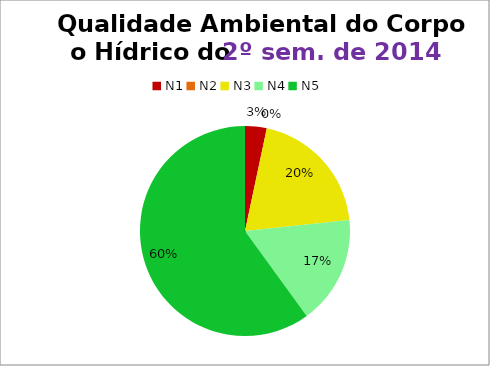
| Category | 2º/14 |
|---|---|
| N1 | 1 |
| N2 | 0 |
| N3 | 6 |
| N4 | 5 |
| N5 | 18 |